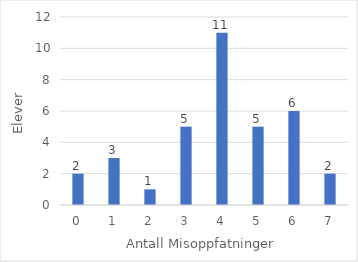
| Category | Series 0 |
|---|---|
| 0.0 | 2 |
| 1.0 | 3 |
| 2.0 | 1 |
| 3.0 | 5 |
| 4.0 | 11 |
| 5.0 | 5 |
| 6.0 | 6 |
| 7.0 | 2 |